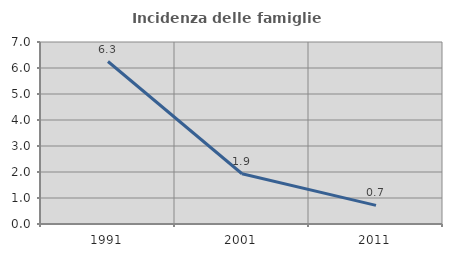
| Category | Incidenza delle famiglie numerose |
|---|---|
| 1991.0 | 6.25 |
| 2001.0 | 1.932 |
| 2011.0 | 0.716 |